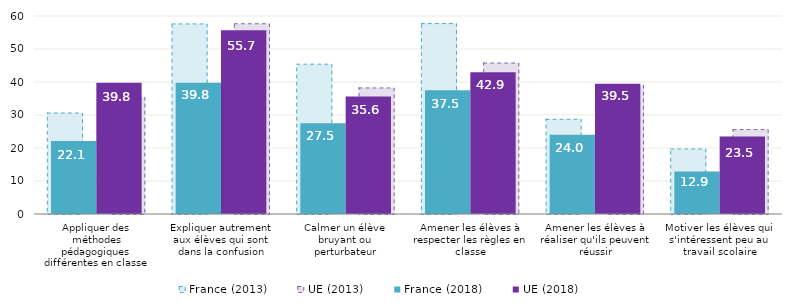
| Category | France (2013) | UE (2013) |
|---|---|---|
| Appliquer des méthodes pédagogiques différentes en classe | 30.6 | 35.38 |
| Expliquer autrement aux élèves qui sont dans la confusion | 57.6 | 57.65 |
| Calmer un élève bruyant ou perturbateur | 45.4 | 38.2 |
| Amener les élèves à respecter les règles en classe | 57.7 | 45.74 |
| Amener les élèves à réaliser qu'ils peuvent réussir | 28.7 | 39.03 |
| Motiver les élèves qui s'intéressent peu au travail scolaire | 19.7 | 25.57 |